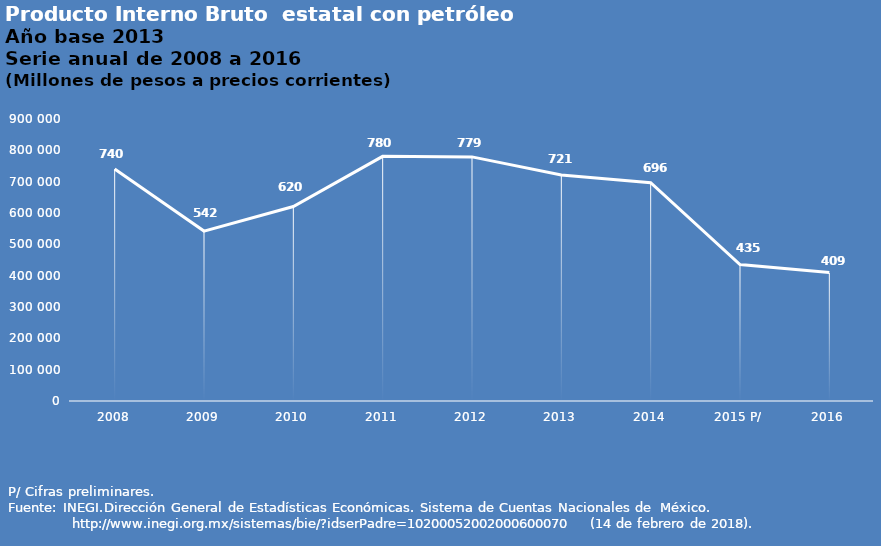
| Category | Series 0 |
|---|---|
| 2008 | 740140.02 |
| 2009 | 542318.291 |
| 2010 | 620535.423 |
| 2011 | 780750.71 |
| 2012 | 779041.23 |
| 2013 | 721083.165 |
| 2014 | 696691.153 |
| 2015 P/ | 435320.468 |
| 2016 | 409872.451 |